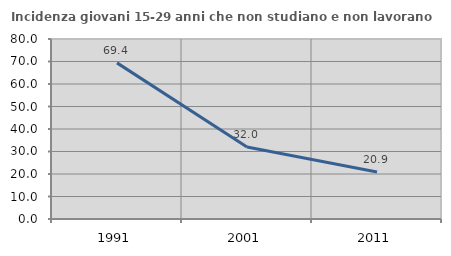
| Category | Incidenza giovani 15-29 anni che non studiano e non lavorano  |
|---|---|
| 1991.0 | 69.388 |
| 2001.0 | 31.967 |
| 2011.0 | 20.93 |